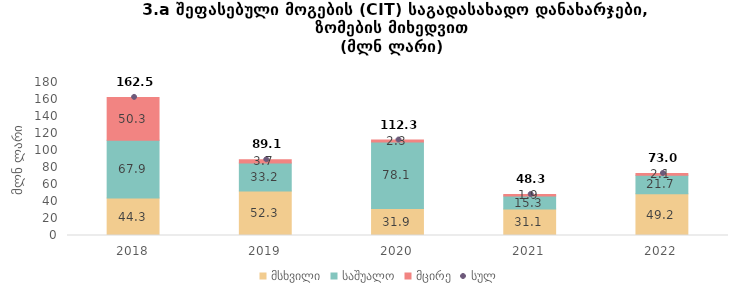
| Category | მსხვილი | საშუალო | მცირე |
|---|---|---|---|
| 2018.0 | 44.26 | 67.89 | 50.33 |
| 2019.0 | 52.26 | 33.18 | 3.65 |
| 2020.0 | 31.91 | 78.06 | 2.35 |
| 2021.0 | 31.11 | 15.27 | 1.88 |
| 2022.0 | 49.19 | 21.74 | 2.06 |